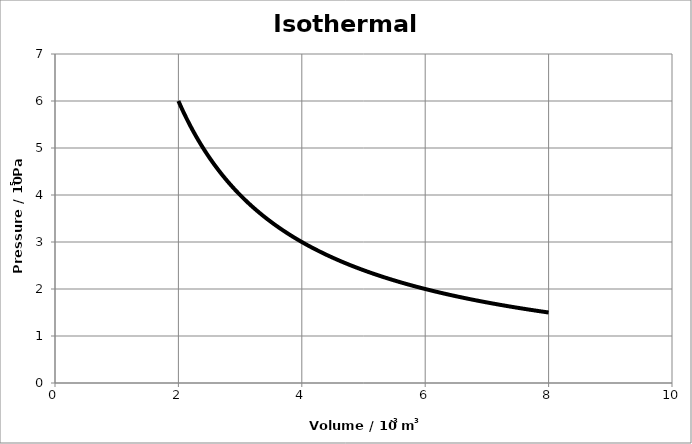
| Category | Series 0 |
|---|---|
| 2.0 | 6 |
| 2.06 | 5.825 |
| 2.12 | 5.66 |
| 2.18 | 5.505 |
| 2.24 | 5.357 |
| 2.3000000000000003 | 5.217 |
| 2.3600000000000003 | 5.085 |
| 2.4200000000000004 | 4.959 |
| 2.4800000000000004 | 4.839 |
| 2.5400000000000005 | 4.724 |
| 2.6000000000000005 | 4.615 |
| 2.6600000000000006 | 4.511 |
| 2.7200000000000006 | 4.412 |
| 2.7800000000000007 | 4.317 |
| 2.8400000000000007 | 4.225 |
| 2.900000000000001 | 4.138 |
| 2.960000000000001 | 4.054 |
| 3.020000000000001 | 3.974 |
| 3.080000000000001 | 3.896 |
| 3.140000000000001 | 3.822 |
| 3.200000000000001 | 3.75 |
| 3.260000000000001 | 3.681 |
| 3.320000000000001 | 3.614 |
| 3.3800000000000012 | 3.55 |
| 3.4400000000000013 | 3.488 |
| 3.5000000000000013 | 3.429 |
| 3.5600000000000014 | 3.371 |
| 3.6200000000000014 | 3.315 |
| 3.6800000000000015 | 3.261 |
| 3.7400000000000015 | 3.209 |
| 3.8000000000000016 | 3.158 |
| 3.8600000000000017 | 3.109 |
| 3.9200000000000017 | 3.061 |
| 3.9800000000000018 | 3.015 |
| 4.040000000000002 | 2.97 |
| 4.100000000000001 | 2.927 |
| 4.160000000000001 | 2.885 |
| 4.220000000000001 | 2.844 |
| 4.28 | 2.804 |
| 4.34 | 2.765 |
| 4.3999999999999995 | 2.727 |
| 4.459999999999999 | 2.691 |
| 4.519999999999999 | 2.655 |
| 4.579999999999998 | 2.62 |
| 4.639999999999998 | 2.586 |
| 4.6999999999999975 | 2.553 |
| 4.759999999999997 | 2.521 |
| 4.819999999999997 | 2.49 |
| 4.879999999999996 | 2.459 |
| 4.939999999999996 | 2.429 |
| 4.999999999999996 | 2.4 |
| 5.059999999999995 | 2.372 |
| 5.119999999999995 | 2.344 |
| 5.179999999999994 | 2.317 |
| 5.239999999999994 | 2.29 |
| 5.299999999999994 | 2.264 |
| 5.359999999999993 | 2.239 |
| 5.419999999999993 | 2.214 |
| 5.479999999999992 | 2.19 |
| 5.539999999999992 | 2.166 |
| 5.599999999999992 | 2.143 |
| 5.659999999999991 | 2.12 |
| 5.719999999999991 | 2.098 |
| 5.7799999999999905 | 2.076 |
| 5.83999999999999 | 2.055 |
| 5.89999999999999 | 2.034 |
| 5.959999999999989 | 2.013 |
| 6.019999999999989 | 1.993 |
| 6.0799999999999885 | 1.974 |
| 6.139999999999988 | 1.954 |
| 6.199999999999988 | 1.935 |
| 6.259999999999987 | 1.917 |
| 6.319999999999987 | 1.899 |
| 6.379999999999987 | 1.881 |
| 6.439999999999986 | 1.863 |
| 6.499999999999986 | 1.846 |
| 6.559999999999985 | 1.829 |
| 6.619999999999985 | 1.813 |
| 6.679999999999985 | 1.796 |
| 6.739999999999984 | 1.78 |
| 6.799999999999984 | 1.765 |
| 6.8599999999999834 | 1.749 |
| 6.919999999999983 | 1.734 |
| 6.979999999999983 | 1.719 |
| 7.039999999999982 | 1.705 |
| 7.099999999999982 | 1.69 |
| 7.1599999999999815 | 1.676 |
| 7.219999999999981 | 1.662 |
| 7.279999999999981 | 1.648 |
| 7.33999999999998 | 1.635 |
| 7.39999999999998 | 1.622 |
| 7.4599999999999795 | 1.609 |
| 7.519999999999979 | 1.596 |
| 7.579999999999979 | 1.583 |
| 7.639999999999978 | 1.571 |
| 7.699999999999978 | 1.558 |
| 7.759999999999978 | 1.546 |
| 7.819999999999977 | 1.535 |
| 7.879999999999977 | 1.523 |
| 7.939999999999976 | 1.511 |
| 7.999999999999976 | 1.5 |